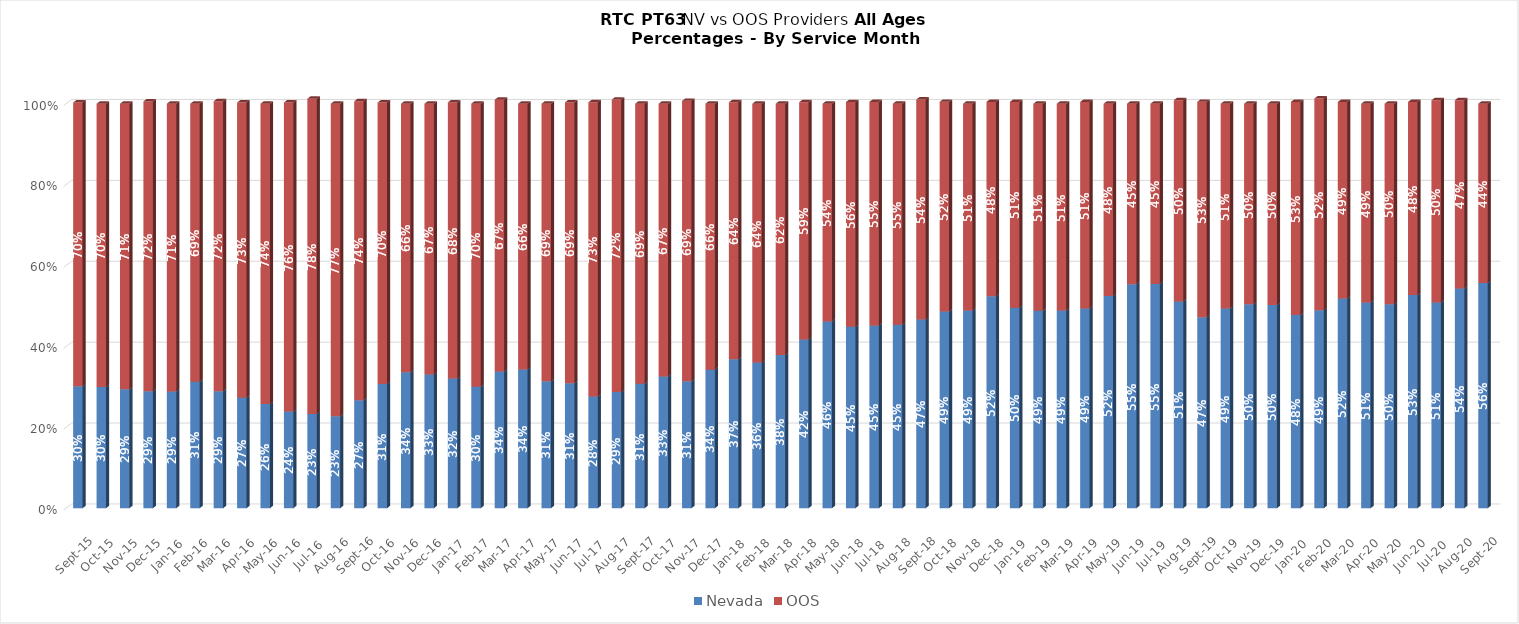
| Category | Nevada | OOS |
|---|---|---|
| 2015-09-01 | 0.301 | 0.701 |
| 2015-10-01 | 0.3 | 0.7 |
| 2015-11-01 | 0.294 | 0.706 |
| 2015-12-01 | 0.289 | 0.717 |
| 2016-01-01 | 0.289 | 0.711 |
| 2016-02-01 | 0.313 | 0.687 |
| 2016-03-01 | 0.289 | 0.717 |
| 2016-04-01 | 0.273 | 0.73 |
| 2016-05-01 | 0.257 | 0.743 |
| 2016-06-01 | 0.239 | 0.764 |
| 2016-07-01 | 0.233 | 0.779 |
| 2016-08-01 | 0.227 | 0.773 |
| 2016-09-01 | 0.267 | 0.739 |
| 2016-10-01 | 0.307 | 0.696 |
| 2016-11-01 | 0.336 | 0.664 |
| 2016-12-01 | 0.33 | 0.67 |
| 2017-01-01 | 0.32 | 0.683 |
| 2017-02-01 | 0.3 | 0.7 |
| 2017-03-01 | 0.338 | 0.672 |
| 2017-04-01 | 0.343 | 0.657 |
| 2017-05-01 | 0.314 | 0.686 |
| 2017-06-01 | 0.309 | 0.694 |
| 2017-07-01 | 0.276 | 0.728 |
| 2017-08-01 | 0.287 | 0.723 |
| 2017-09-01 | 0.307 | 0.693 |
| 2017-10-01 | 0.326 | 0.674 |
| 2017-11-01 | 0.314 | 0.693 |
| 2017-12-01 | 0.342 | 0.658 |
| 2018-01-01 | 0.368 | 0.635 |
| 2018-02-01 | 0.36 | 0.64 |
| 2018-03-01 | 0.379 | 0.621 |
| 2018-04-01 | 0.417 | 0.586 |
| 2018-05-01 | 0.462 | 0.538 |
| 2018-06-01 | 0.448 | 0.556 |
| 2018-07-01 | 0.451 | 0.553 |
| 2018-08-01 | 0.454 | 0.546 |
| 2018-09-01 | 0.467 | 0.544 |
| 2018-10-01 | 0.486 | 0.519 |
| 2018-11-01 | 0.488 | 0.512 |
| 2018-12-01 | 0.524 | 0.48 |
| 2019-01-01 | 0.496 | 0.509 |
| 2019-02-01 | 0.488 | 0.512 |
| 2019-03-01 | 0.489 | 0.511 |
| 2019-04-01 | 0.494 | 0.511 |
| 2019-05-01 | 0.525 | 0.475 |
| 2019-06-01 | 0.554 | 0.446 |
| 2019-07-01 | 0.554 | 0.446 |
| 2019-08-01 | 0.511 | 0.498 |
| 2019-09-01 | 0.472 | 0.533 |
| 2019-10-01 | 0.494 | 0.506 |
| 2019-11-01 | 0.504 | 0.496 |
| 2019-12-01 | 0.502 | 0.498 |
| 2020-01-01 | 0.478 | 0.527 |
| 2020-02-01 | 0.489 | 0.523 |
| 2020-03-01 | 0.519 | 0.485 |
| 2020-04-01 | 0.508 | 0.492 |
| 2020-05-01 | 0.504 | 0.496 |
| 2020-06-01 | 0.527 | 0.477 |
| 2020-07-01 | 0.508 | 0.5 |
| 2020-08-01 | 0.543 | 0.466 |
| 2020-09-01 | 0.556 | 0.444 |